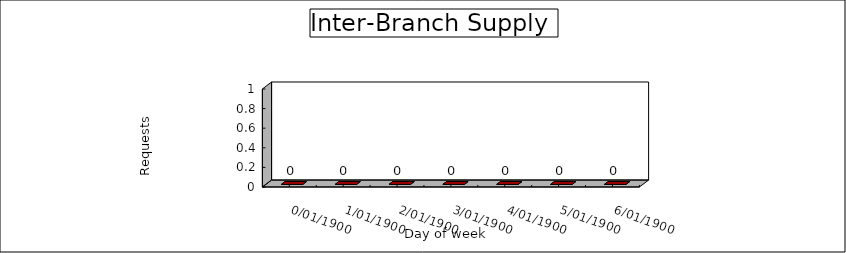
| Category | Branch Delivery |
|---|---|
| 0 | 0 |
| 1900-01-01 | 0 |
| 1900-01-02 | 0 |
| 1900-01-03 | 0 |
| 1900-01-04 | 0 |
| 1900-01-05 | 0 |
| 1900-01-06 | 0 |